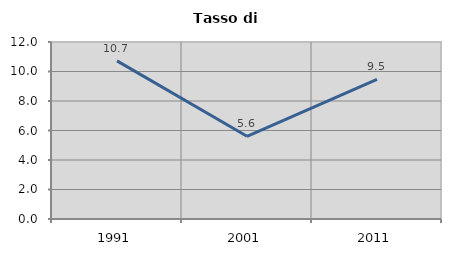
| Category | Tasso di disoccupazione   |
|---|---|
| 1991.0 | 10.722 |
| 2001.0 | 5.606 |
| 2011.0 | 9.458 |